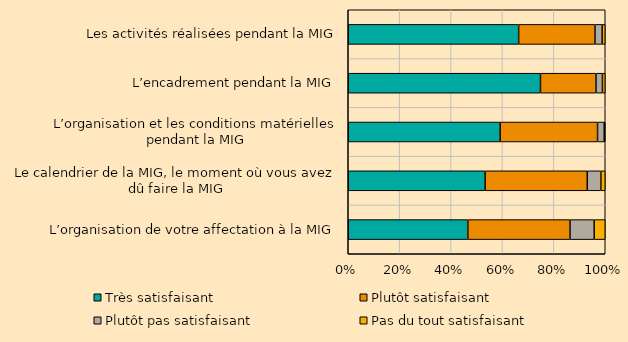
| Category | Très satisfaisant | Plutôt satisfaisant | Plutôt pas satisfaisant | Pas du tout satisfaisant |
|---|---|---|---|---|
| L’organisation de votre affectation à la MIG | 0.465 | 0.397 | 0.094 | 0.043 |
| Le calendrier de la MIG, le moment où vous avez dû faire la MIG | 0.533 | 0.398 | 0.053 | 0.017 |
| L’organisation et les conditions matérielles pendant la MIG | 0.591 | 0.379 | 0.026 | 0.004 |
| L’encadrement pendant la MIG | 0.748 | 0.216 | 0.025 | 0.011 |
| Les activités réalisées pendant la MIG | 0.663 | 0.297 | 0.028 | 0.012 |